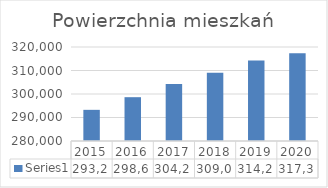
| Category | Series 0 |
|---|---|
| 2015.0 | 293259 |
| 2016.0 | 298644 |
| 2017.0 | 304254 |
| 2018.0 | 309061 |
| 2019.0 | 314270 |
| 2020.0 | 317339 |